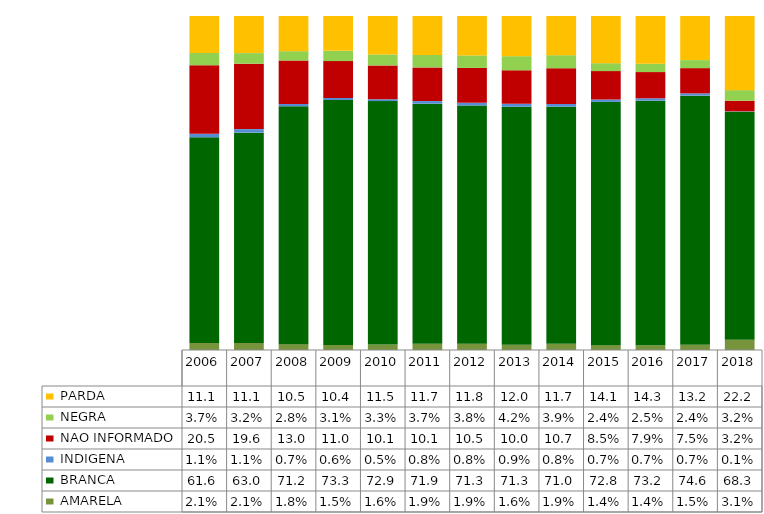
| Category |  AMARELA     |  BRANCA      |  INDIGENA    |  NAO INFORMADO  |  NEGRA       |  PARDA       |
|---|---|---|---|---|---|---|
| 2006.0 | 0.021 | 0.616 | 0.011 | 0.205 | 0.037 | 0.111 |
| 2007.0 | 0.021 | 0.63 | 0.011 | 0.196 | 0.032 | 0.111 |
| 2008.0 | 0.018 | 0.712 | 0.007 | 0.13 | 0.028 | 0.105 |
| 2009.0 | 0.015 | 0.733 | 0.006 | 0.11 | 0.031 | 0.104 |
| 2010.0 | 0.016 | 0.729 | 0.005 | 0.101 | 0.033 | 0.115 |
| 2011.0 | 0.019 | 0.719 | 0.008 | 0.101 | 0.037 | 0.117 |
| 2012.0 | 0.019 | 0.713 | 0.008 | 0.105 | 0.038 | 0.118 |
| 2013.0 | 0.016 | 0.713 | 0.009 | 0.1 | 0.042 | 0.12 |
| 2014.0 | 0.019 | 0.71 | 0.008 | 0.107 | 0.039 | 0.117 |
| 2015.0 | 0.014 | 0.728 | 0.007 | 0.085 | 0.024 | 0.141 |
| 2016.0 | 0.014 | 0.732 | 0.007 | 0.079 | 0.025 | 0.143 |
| 2017.0 | 0.015 | 0.746 | 0.007 | 0.075 | 0.024 | 0.132 |
| 2018.0 | 0.031 | 0.683 | 0.001 | 0.032 | 0.032 | 0.222 |